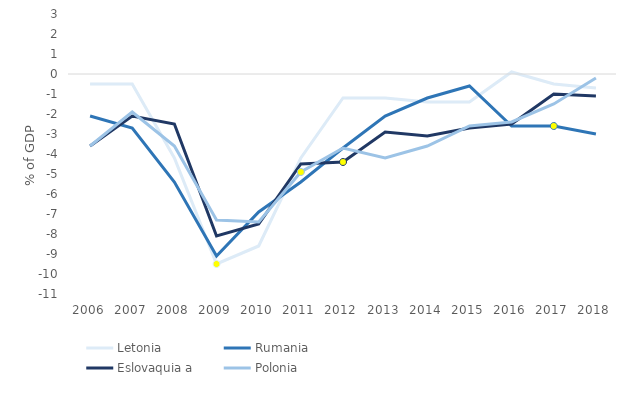
| Category | Letonia | Rumania | Eslovaquia a  | Polonia |
|---|---|---|---|---|
| 2006.0 | -0.5 | -2.1 | -3.6 | -3.6 |
| 2007.0 | -0.5 | -2.7 | -2.1 | -1.9 |
| 2008.0 | -4.2 | -5.4 | -2.5 | -3.6 |
| 2009.0 | -9.5 | -9.1 | -8.1 | -7.3 |
| 2010.0 | -8.6 | -6.9 | -7.5 | -7.4 |
| 2011.0 | -4.2 | -5.4 | -4.5 | -4.9 |
| 2012.0 | -1.2 | -3.7 | -4.4 | -3.7 |
| 2013.0 | -1.2 | -2.1 | -2.9 | -4.2 |
| 2014.0 | -1.4 | -1.2 | -3.1 | -3.6 |
| 2015.0 | -1.4 | -0.6 | -2.7 | -2.6 |
| 2016.0 | 0.1 | -2.6 | -2.5 | -2.4 |
| 2017.0 | -0.5 | -2.6 | -1 | -1.5 |
| 2018.0 | -0.7 | -3 | -1.1 | -0.2 |